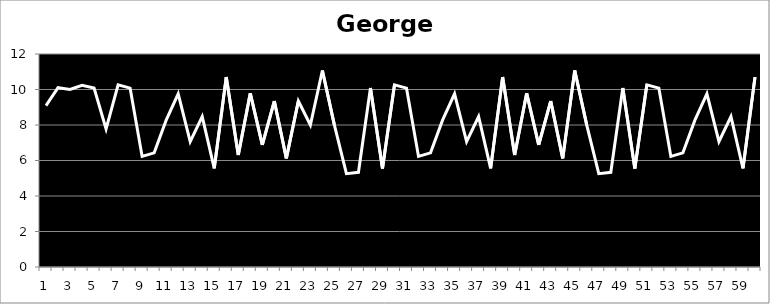
| Category | George |
|---|---|
| 0 | 9.095 |
| 1 | 10.101 |
| 2 | 10.005 |
| 3 | 10.238 |
| 4 | 10.08 |
| 5 | 7.775 |
| 6 | 10.263 |
| 7 | 10.078 |
| 8 | 6.229 |
| 9 | 6.431 |
| 10 | 8.272 |
| 11 | 9.757 |
| 12 | 7.067 |
| 13 | 8.476 |
| 14 | 5.556 |
| 15 | 10.699 |
| 16 | 6.309 |
| 17 | 9.79 |
| 18 | 6.878 |
| 19 | 9.349 |
| 20 | 6.118 |
| 21 | 9.351 |
| 22 | 8.001 |
| 23 | 11.071 |
| 24 | 7.992 |
| 25 | 5.26 |
| 26 | 5.334 |
| 27 | 10.08 |
| 28 | 5.55 |
| 29 | 10.263 |
| 30 | 10.078 |
| 31 | 6.229 |
| 32 | 6.431 |
| 33 | 8.272 |
| 34 | 9.757 |
| 35 | 7.067 |
| 36 | 8.476 |
| 37 | 5.556 |
| 38 | 10.699 |
| 39 | 6.309 |
| 40 | 9.79 |
| 41 | 6.878 |
| 42 | 9.349 |
| 43 | 6.118 |
| 44 | 11.071 |
| 45 | 7.992 |
| 46 | 5.26 |
| 47 | 5.334 |
| 48 | 10.08 |
| 49 | 5.55 |
| 50 | 10.263 |
| 51 | 10.078 |
| 52 | 6.229 |
| 53 | 6.431 |
| 54 | 8.272 |
| 55 | 9.757 |
| 56 | 7.067 |
| 57 | 8.476 |
| 58 | 5.556 |
| 59 | 10.699 |